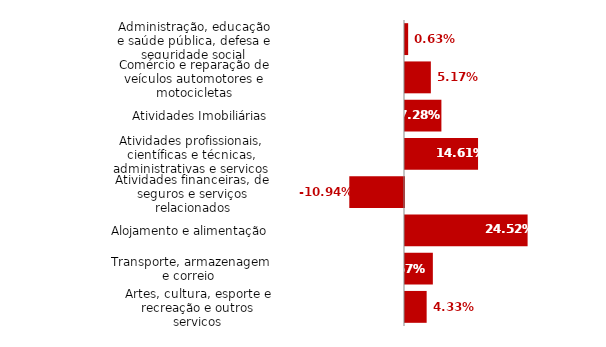
| Category | Series 0 |
|---|---|
| Administração, educação e saúde pública, defesa e seguridade social | 0.006 |
| Comércio e reparação de veículos automotores e motocicletas | 0.052 |
| Atividades Imobiliárias | 0.073 |
| Atividades profissionais, científicas e técnicas, administrativas e serviços complementares | 0.146 |
| Atividades financeiras, de seguros e serviços relacionados | -0.109 |
| Alojamento e alimentação | 0.245 |
| Transporte, armazenagem e correio  | 0.056 |
| Artes, cultura, esporte e recreação e outros serviços | 0.043 |